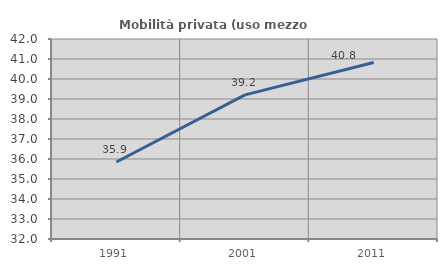
| Category | Mobilità privata (uso mezzo privato) |
|---|---|
| 1991.0 | 35.851 |
| 2001.0 | 39.205 |
| 2011.0 | 40.825 |